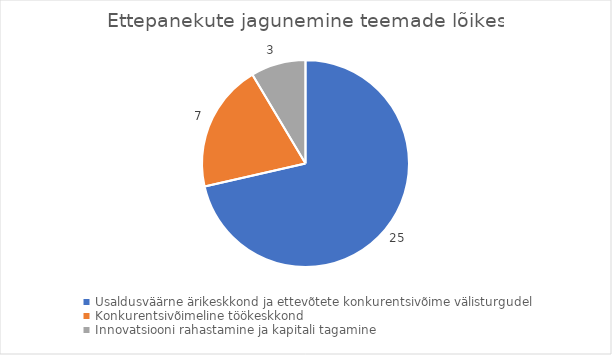
| Category | Ettepanekute jagunemine teemade lõikes |
|---|---|
| Usaldusväärne ärikeskkond ja ettevõtete konkurentsivõime välisturgudel | 25 |
| Konkurentsivõimeline töökeskkond | 7 |
| Innovatsiooni rahastamine ja kapitali tagamine | 3 |